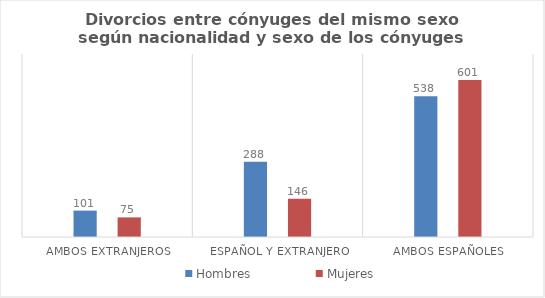
| Category | Hombres | Mujeres |
|---|---|---|
| Ambos extranjeros | 101 | 75 |
| Español y extranjero | 288 | 146 |
| Ambos españoles | 538 | 601 |